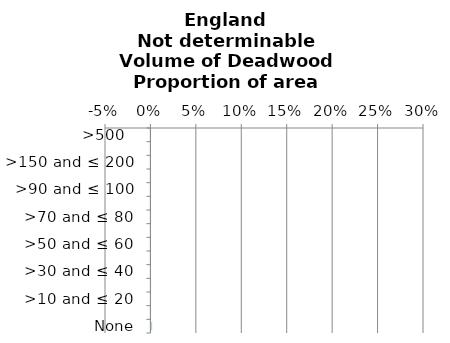
| Category | Not determinable |
|---|---|
|  None | 0.001 |
| >0 and ≤ 10 | 0 |
| >10 and ≤ 20  | 0 |
| >20 and ≤ 30  | 0 |
| >30 and ≤ 40  | 0 |
| >40 and ≤ 50  | 0 |
| >50 and ≤ 60  | 0 |
| >60 and ≤ 70  | 0 |
| >70 and ≤ 80  | 0 |
| >80 and ≤ 90  | 0 |
| >90 and ≤ 100  | 0 |
| >100 and ≤ 150 | 0 |
| >150 and ≤ 200  | 0 |
| >200 and ≤ 500 | 0 |
| >500   | 0 |